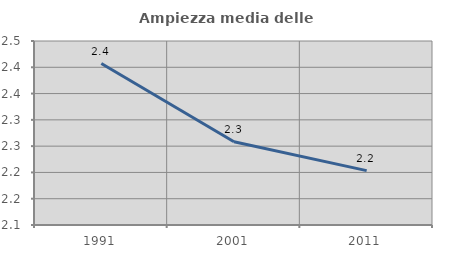
| Category | Ampiezza media delle famiglie |
|---|---|
| 1991.0 | 2.407 |
| 2001.0 | 2.258 |
| 2011.0 | 2.203 |